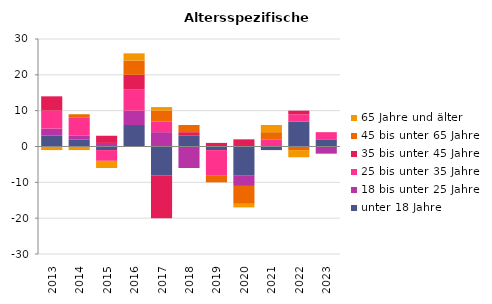
| Category | unter 18 Jahre | 18 bis unter 25 Jahre | 25 bis unter 35 Jahre | 35 bis unter 45 Jahre | 45 bis unter 65 Jahre | 65 Jahre und älter |
|---|---|---|---|---|---|---|
| 2013.0 | 3 | 2 | 5 | 4 | 0 | -1 |
| 2014.0 | 2 | 1 | 5 | 0 | 1 | -1 |
| 2015.0 | -1 | 1 | -3 | 2 | 0 | -2 |
| 2016.0 | 6 | 4 | 6 | 4 | 4 | 2 |
| 2017.0 | -8 | 4 | 3 | -12 | 3 | 1 |
| 2018.0 | 3 | -6 | 0 | 1 | 2 | 0 |
| 2019.0 | -1 | 0 | -7 | 1 | -2 | 0 |
| 2020.0 | -8 | -3 | 0 | 2 | -5 | -1 |
| 2021.0 | -1 | 0 | 2 | 0 | 2 | 2 |
| 2022.0 | 7 | 0 | 2 | 1 | -1 | -2 |
| 2023.0 | 2 | -2 | 2 | 0 | 0 | 0 |